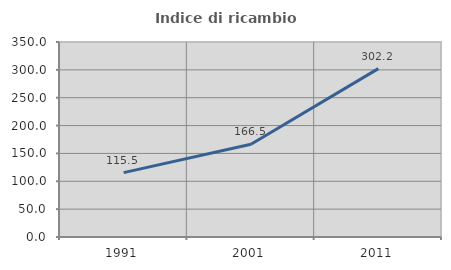
| Category | Indice di ricambio occupazionale  |
|---|---|
| 1991.0 | 115.522 |
| 2001.0 | 166.502 |
| 2011.0 | 302.153 |